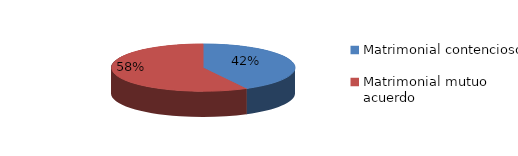
| Category | Series 0 |
|---|---|
| 0 | 568 |
| 1 | 779 |